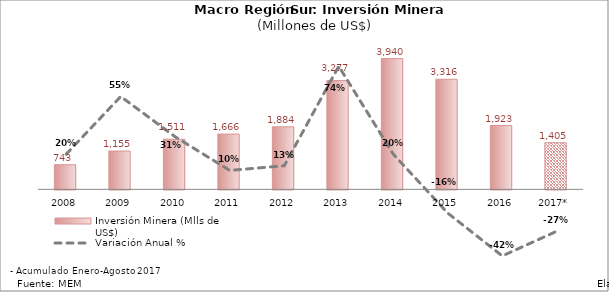
| Category | Inversión Minera (Mlls de US$) |
|---|---|
| 2008 | 742.734 |
| 2009 | 1154.702 |
| 2010 | 1510.531 |
| 2011 | 1665.655 |
| 2012 | 1884.279 |
| 2013 | 3277.439 |
| 2014 | 3940.013 |
| 2015 | 3316.431 |
| 2016 | 1923.232 |
| 2017* | 1405.329 |